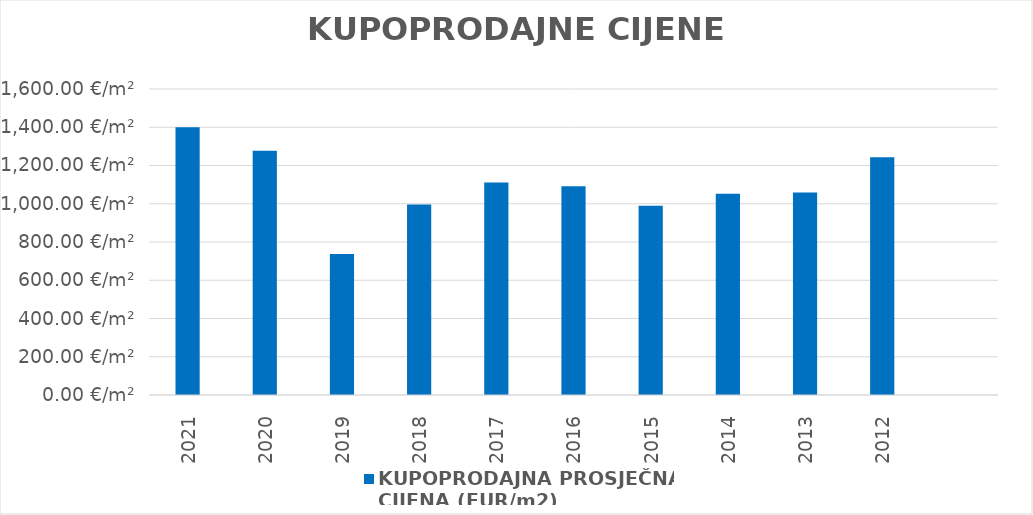
| Category | KUPOPRODAJNA PROSJEČNA 
CIJENA (EUR/m2) |
|---|---|
| 2021 | 1903-10-31 04:01:15 |
| 2020 | 1903-06-30 17:17:16 |
| 2019 | 1902-01-06 12:29:50 |
| 2018 | 1902-09-22 10:10:09 |
| 2017 | 1903-01-15 00:29:00 |
| 2016 | 1902-12-26 16:08:12 |
| 2015 | 1902-09-15 15:03:00 |
| 2014 | 1902-11-17 01:09:04 |
| 2013 | 1902-11-23 06:48:07 |
| 2012 | 1903-05-27 10:38:42 |